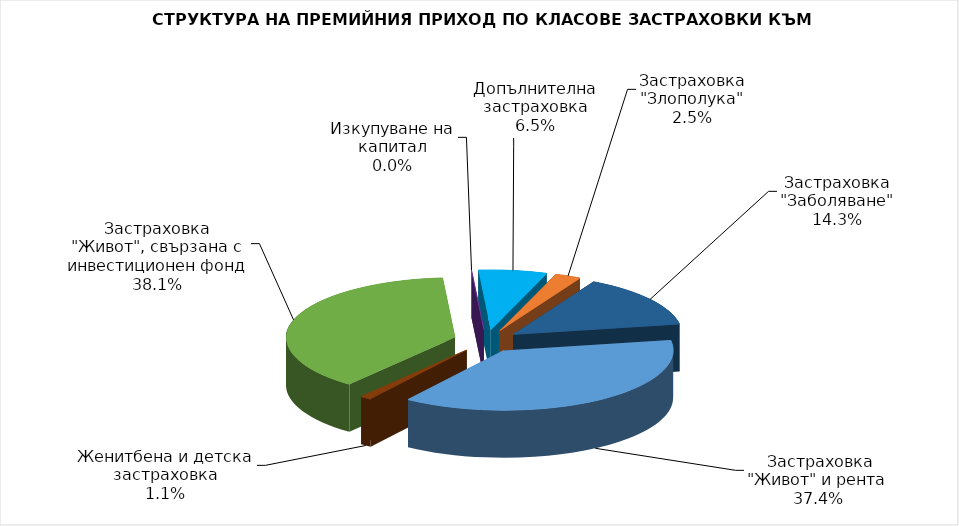
| Category |  Застраховка "Живот" и рента |
|---|---|
|  Застраховка "Живот" и рента | 110837858.198 |
| Женитбена и детска застраховка | 3299618.328 |
| Застраховка "Живот", свързана с инвестиционен фонд | 112850316.796 |
| Изкупуване на капитал | 0 |
| Допълнителна застраховка | 19406820.367 |
| Застраховка "Злополука" | 7420634.693 |
| Застраховка "Заболяване" | 42494899.662 |